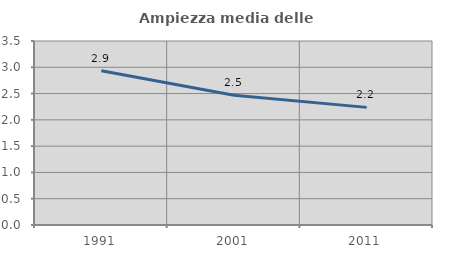
| Category | Ampiezza media delle famiglie |
|---|---|
| 1991.0 | 2.934 |
| 2001.0 | 2.468 |
| 2011.0 | 2.237 |